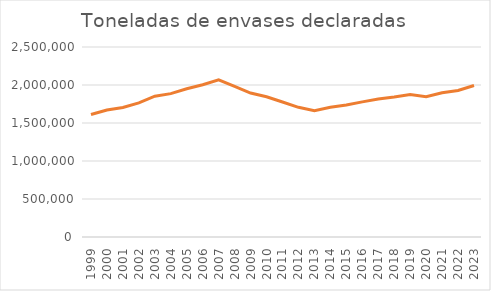
| Category | Total general (Tn) |
|---|---|
| 1999.0 | 1611197.134 |
| 2000.0 | 1671344.736 |
| 2001.0 | 1703415.647 |
| 2002.0 | 1764958.049 |
| 2003.0 | 1852392.58 |
| 2004.0 | 1886463.568 |
| 2005.0 | 1950777.939 |
| 2006.0 | 2002591.979 |
| 2007.0 | 2067320 |
| 2008.0 | 1982213.15 |
| 2009.0 | 1894161.37 |
| 2010.0 | 1844665.051 |
| 2011.0 | 1776640.51 |
| 2012.0 | 1706512.847 |
| 2013.0 | 1662914.555 |
| 2014.0 | 1707264.776 |
| 2015.0 | 1737442.128 |
| 2016.0 | 1778038.534 |
| 2017.0 | 1815864.097 |
| 2018.0 | 1843422.707 |
| 2019.0 | 1876270.061 |
| 2020.0 | 1846764.633 |
| 2021.0 | 1897715.2 |
| 2022.0 | 1927441.676 |
| 2023.0 | 1993612.627 |